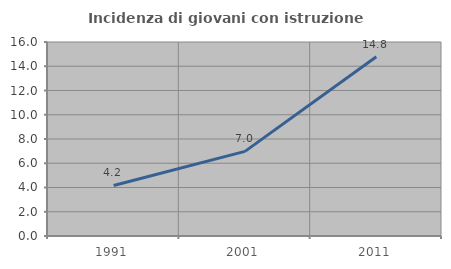
| Category | Incidenza di giovani con istruzione universitaria |
|---|---|
| 1991.0 | 4.167 |
| 2001.0 | 6.98 |
| 2011.0 | 14.781 |